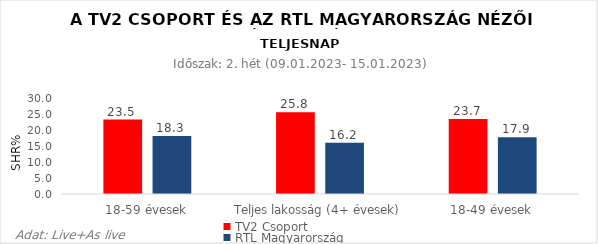
| Category | TV2 Csoport | RTL Magyarország |
|---|---|---|
| 18-59 évesek | 23.5 | 18.3 |
| Teljes lakosság (4+ évesek) | 25.8 | 16.2 |
| 18-49 évesek | 23.7 | 17.9 |